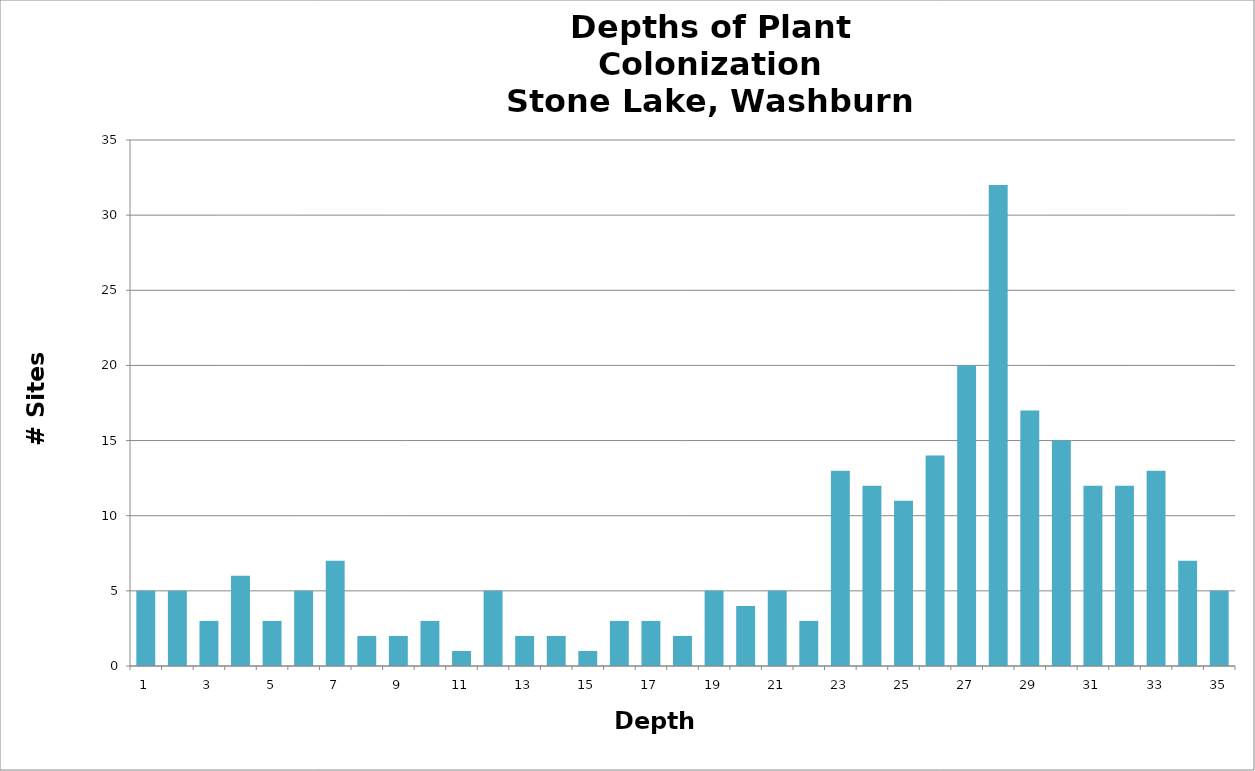
| Category | Series 0 |
|---|---|
| 1.0 | 5 |
| 2.0 | 5 |
| 3.0 | 3 |
| 4.0 | 6 |
| 5.0 | 3 |
| 6.0 | 5 |
| 7.0 | 7 |
| 8.0 | 2 |
| 9.0 | 2 |
| 10.0 | 3 |
| 11.0 | 1 |
| 12.0 | 5 |
| 13.0 | 2 |
| 14.0 | 2 |
| 15.0 | 1 |
| 16.0 | 3 |
| 17.0 | 3 |
| 18.0 | 2 |
| 19.0 | 5 |
| 20.0 | 4 |
| 21.0 | 5 |
| 22.0 | 3 |
| 23.0 | 13 |
| 24.0 | 12 |
| 25.0 | 11 |
| 26.0 | 14 |
| 27.0 | 20 |
| 28.0 | 32 |
| 29.0 | 17 |
| 30.0 | 15 |
| 31.0 | 12 |
| 32.0 | 12 |
| 33.0 | 13 |
| 34.0 | 7 |
| 35.0 | 5 |